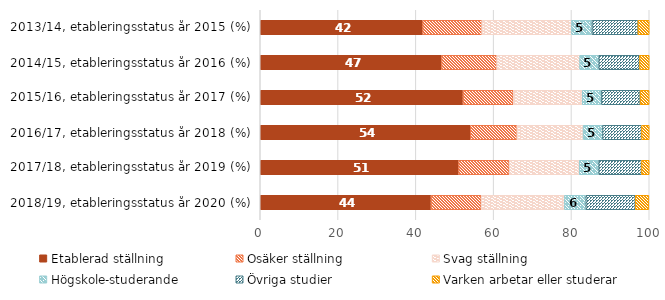
| Category | Etablerad ställning | Osäker ställning | Svag ställning | Högskole-studerande | Övriga studier | Varken arbetar eller studerar |
|---|---|---|---|---|---|---|
| 2018/19, etableringsstatus år 2020 (%) | 43.9 | 12.9 | 21.4 | 5.5 | 12.7 | 3.5 |
| 2017/18, etableringsstatus år 2019 (%) | 51 | 13 | 18 | 5 | 11 | 3 |
| 2016/17, etableringsstatus år 2018 (%) | 54 | 12 | 17 | 5 | 10 | 2 |
| 2015/16, etableringsstatus år 2017 (%) | 52.12 | 12.92 | 17.73 | 4.93 | 9.96 | 2.33 |
| 2014/15, etableringsstatus år 2016 (%) | 46.61 | 14.18 | 21.33 | 4.9 | 10.49 | 2.49 |
| 2013/14, etableringsstatus år 2015 (%) | 41.76 | 15.2 | 23.05 | 5.26 | 11.82 | 2.91 |